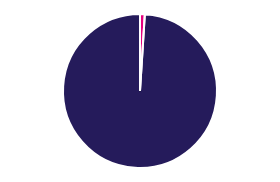
| Category | Series 0 |
|---|---|
| 0 | 0.01 |
| 1 | 0.99 |